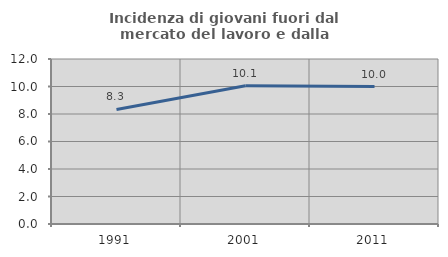
| Category | Incidenza di giovani fuori dal mercato del lavoro e dalla formazione  |
|---|---|
| 1991.0 | 8.333 |
| 2001.0 | 10.053 |
| 2011.0 | 10 |